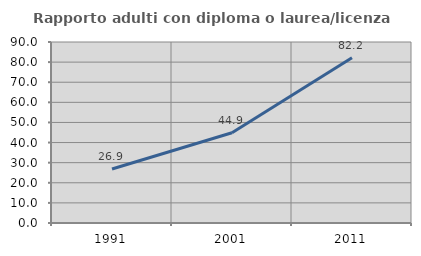
| Category | Rapporto adulti con diploma o laurea/licenza media  |
|---|---|
| 1991.0 | 26.852 |
| 2001.0 | 44.853 |
| 2011.0 | 82.209 |